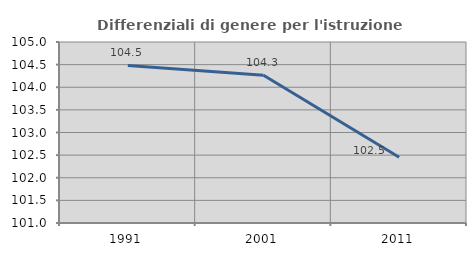
| Category | Differenziali di genere per l'istruzione superiore |
|---|---|
| 1991.0 | 104.481 |
| 2001.0 | 104.265 |
| 2011.0 | 102.451 |